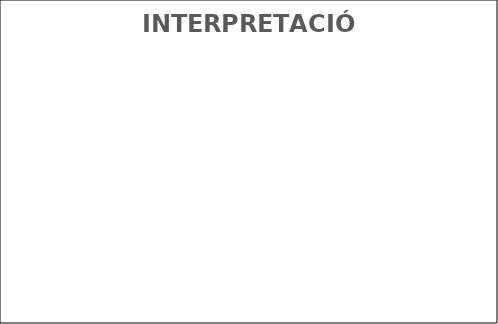
| Category | INTERPRETACIÓN |
|---|---|
| Puntaje Visual | 0 |
| Puntaje Auditivo | 0 |
| Puntaje Kinestésico | 0 |